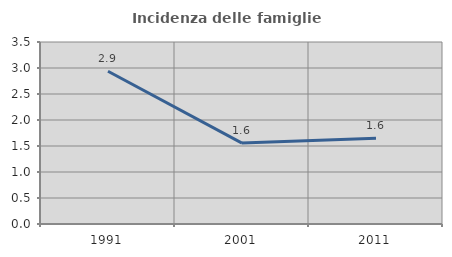
| Category | Incidenza delle famiglie numerose |
|---|---|
| 1991.0 | 2.937 |
| 2001.0 | 1.556 |
| 2011.0 | 1.648 |